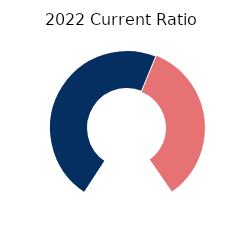
| Category | Current |
|---|---|
| 0 | 75.226 |
| 1 | 54.774 |
| 2 | 30 |